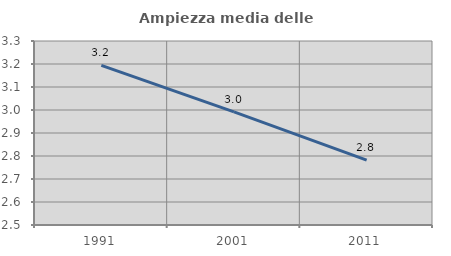
| Category | Ampiezza media delle famiglie |
|---|---|
| 1991.0 | 3.194 |
| 2001.0 | 2.991 |
| 2011.0 | 2.782 |